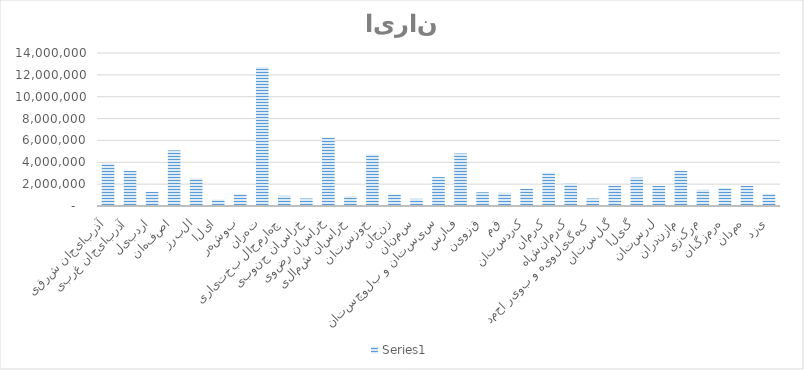
| Category | Series 0 |
|---|---|
| آذربایجان شرقی | 3892406.674 |
| آذربایجان غربی | 3217513.581 |
| اردبیل | 1302700.621 |
| اصفهان | 5093088.571 |
| البرز | 2519077.706 |
| ایلام | 580721.963 |
| بوشهر | 1075120.392 |
| تهران | 12720950.036 |
| چهارمحال بختیاری | 933863.698 |
| خراسان جنوبی | 690588.281 |
| خراسان رضوی | 6262380.092 |
| خراسان شمالی | 902473.322 |
| خوزستان | 4732099.242 |
| زنجان | 1059425.204 |
| سمنان | 659197.904 |
| سیستان و بلوچستان | 2644639.212 |
| فارس | 4802727.589 |
| قزوین | 1255615.056 |
| قم | 1200681.897 |
| کردستان | 1561671.226 |
| کرمان | 3068409.293 |
| کرمانشاه | 2032526.872 |
| کهگیلویه و بویر احمد | 690588.281 |
| گلستان | 1852032.208 |
| گیلان | 2589706.053 |
| لرستان | 1828489.425 |
| مازندران | 3209665.987 |
| مرکزی | 1475347.691 |
| هرمزگان | 1647994.761 |
| همدان | 1836337.019 |
| یزد | 1122205.956 |